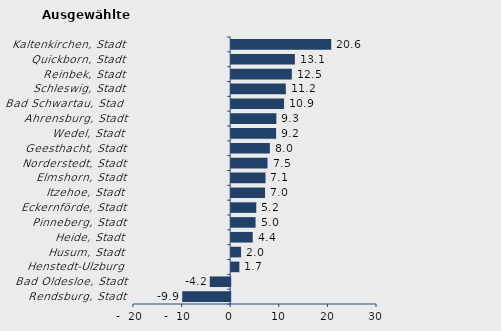
| Category | Wanderungssaldo |
|---|---|
| Rendsburg, Stadt | -9.87 |
| Bad Oldesloe, Stadt | -4.203 |
| Henstedt-Ulzburg | 1.674 |
| Husum, Stadt | 2.03 |
| Heide, Stadt | 4.427 |
| Pinneberg, Stadt | 5.014 |
| Eckernförde, Stadt | 5.159 |
| Itzehoe, Stadt | 6.964 |
| Elmshorn, Stadt | 7.057 |
| Norderstedt, Stadt | 7.479 |
| Geesthacht, Stadt | 7.954 |
| Wedel, Stadt | 9.241 |
| Ahrensburg, Stadt | 9.291 |
| Bad Schwartau, Stadt | 10.88 |
| Schleswig, Stadt | 11.236 |
| Reinbek, Stadt | 12.478 |
| Quickborn, Stadt | 13.101 |
| Kaltenkirchen, Stadt | 20.584 |